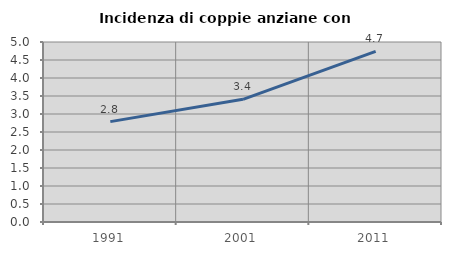
| Category | Incidenza di coppie anziane con figli |
|---|---|
| 1991.0 | 2.788 |
| 2001.0 | 3.408 |
| 2011.0 | 4.741 |